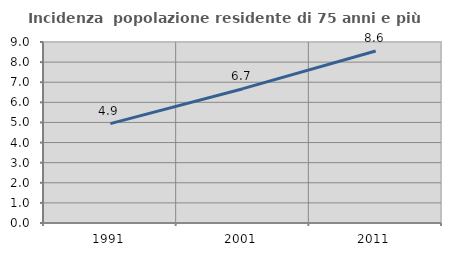
| Category | Incidenza  popolazione residente di 75 anni e più |
|---|---|
| 1991.0 | 4.939 |
| 2001.0 | 6.679 |
| 2011.0 | 8.551 |